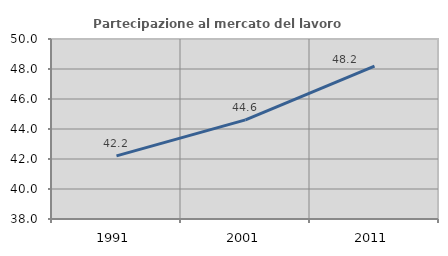
| Category | Partecipazione al mercato del lavoro  femminile |
|---|---|
| 1991.0 | 42.206 |
| 2001.0 | 44.605 |
| 2011.0 | 48.196 |